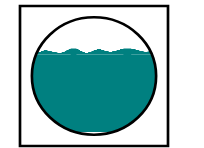
| Category | Series 0 | Series 1 | Series 2 |
|---|---|---|---|
| 0 | 0.67 | 0.05 | 0.28 |